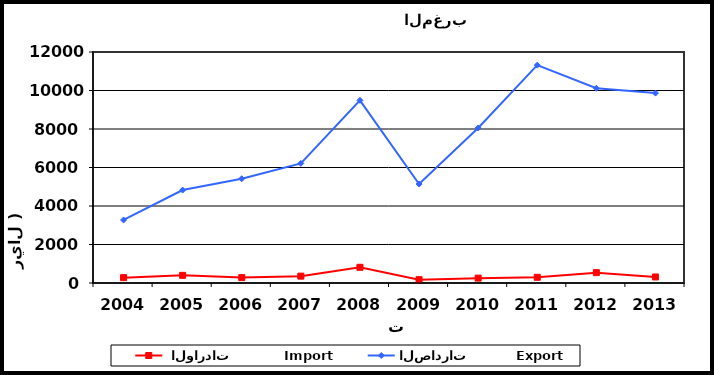
| Category |  الواردات           Import | الصادرات          Export |
|---|---|---|
| 2004.0 | 278 | 3275 |
| 2005.0 | 397 | 4827 |
| 2006.0 | 280 | 5417 |
| 2007.0 | 357 | 6214 |
| 2008.0 | 815 | 9489 |
| 2009.0 | 174 | 5141 |
| 2010.0 | 253 | 8053 |
| 2011.0 | 297 | 11318 |
| 2012.0 | 538 | 10117 |
| 2013.0 | 314 | 9866 |